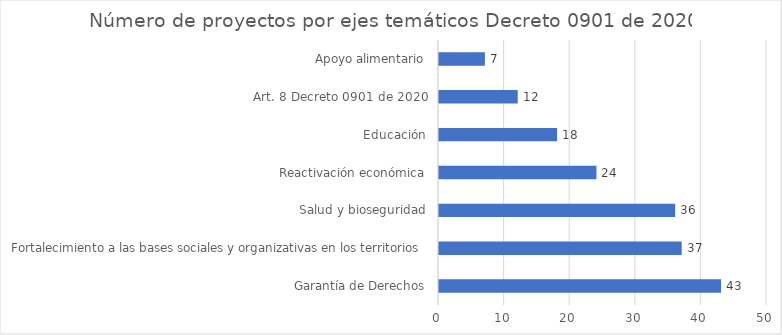
| Category | Series 0 |
|---|---|
| Garantía de Derechos | 43 |
| Fortalecimiento a las bases sociales y organizativas en los territorios | 37 |
| Salud y bioseguridad | 36 |
| Reactivación económica | 24 |
| Educación | 18 |
| Art. 8 Decreto 0901 de 2020 | 12 |
| Apoyo alimentario | 7 |